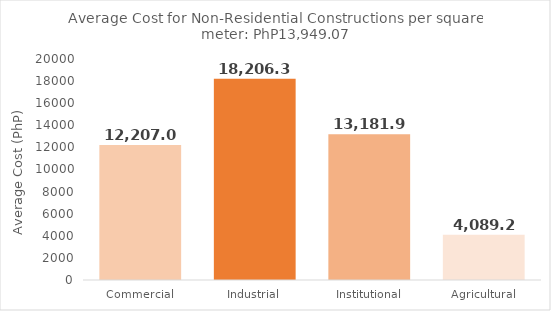
| Category | No |
|---|---|
| Commercial | 12207.068 |
| Industrial | 18206.388 |
| Institutional | 13181.952 |
| Agricultural | 4089.22 |